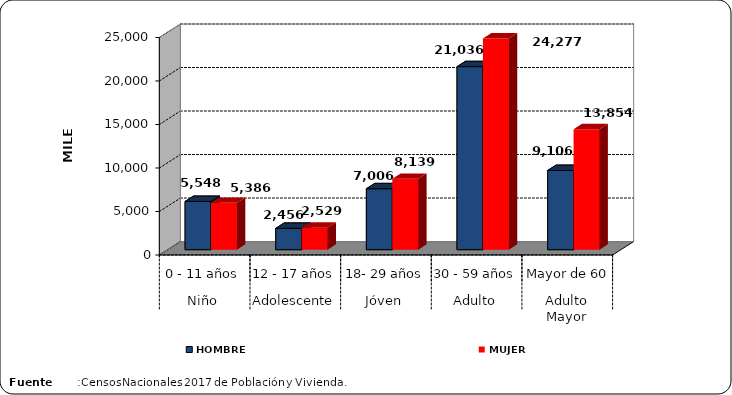
| Category | HOMBRE | MUJER |
|---|---|---|
| 0 | 5548 | 5386 |
| 1 | 2456 | 2529 |
| 2 | 7006 | 8139 |
| 3 | 21036 | 24277 |
| 4 | 9106 | 13854 |